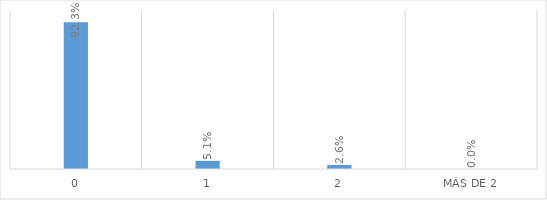
| Category | Series 0 |
|---|---|
| 0 | 0.923 |
| 1 | 0.051 |
| 2 | 0.026 |
| Más de 2 | 0 |